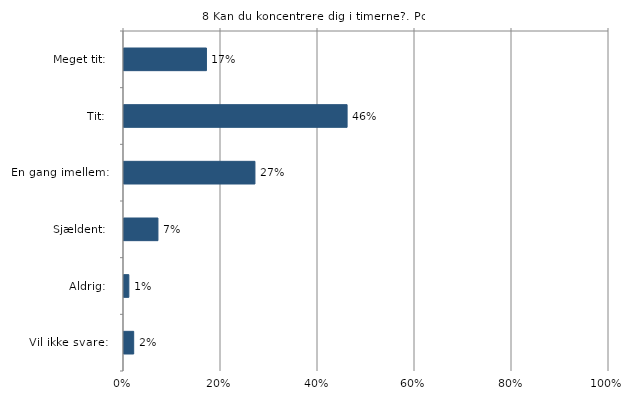
| Category | Kan du koncentrere dig i timerne? |
|---|---|
| Meget tit:   | 0.17 |
| Tit:   | 0.46 |
| En gang imellem:   | 0.27 |
| Sjældent:   | 0.07 |
| Aldrig:   | 0.01 |
| Vil ikke svare:   | 0.02 |